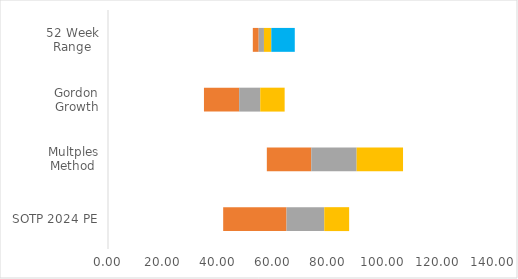
| Category | Series 0 | Series 1 | Series 2 | Series 3 | Series 4 |
|---|---|---|---|---|---|
| SOTP 2024 PE | 41.883 | 23.037 | 13.722 | 9.045 | 10.289 |
| Multples Method | 57.757 | 16.161 | 16.506 | 16.859 | 17.219 |
| Gordon Growth | 34.896 | 12.795 | 7.668 | 8.878 | 20.556 |
| 52 Week Range | 52.66 | 2.14 | 1.91 | 2.668 | 8.542 |